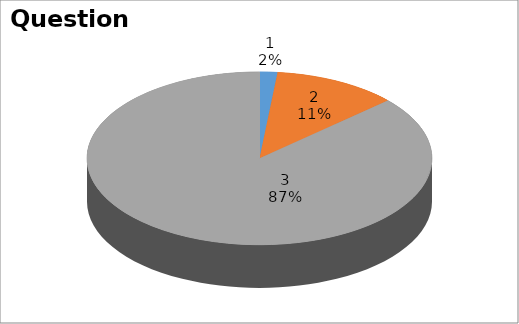
| Category | Series 0 |
|---|---|
| 0 | 1 |
| 1 | 7 |
| 2 | 52 |